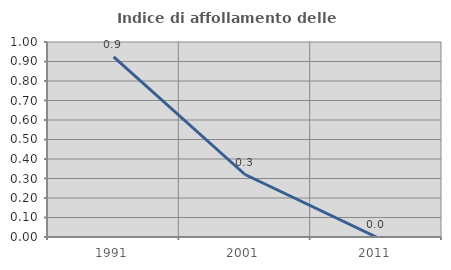
| Category | Indice di affollamento delle abitazioni  |
|---|---|
| 1991.0 | 0.924 |
| 2001.0 | 0.321 |
| 2011.0 | 0 |